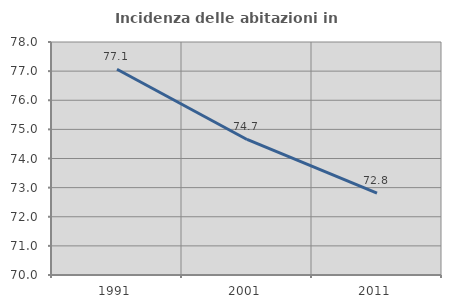
| Category | Incidenza delle abitazioni in proprietà  |
|---|---|
| 1991.0 | 77.066 |
| 2001.0 | 74.653 |
| 2011.0 | 72.814 |